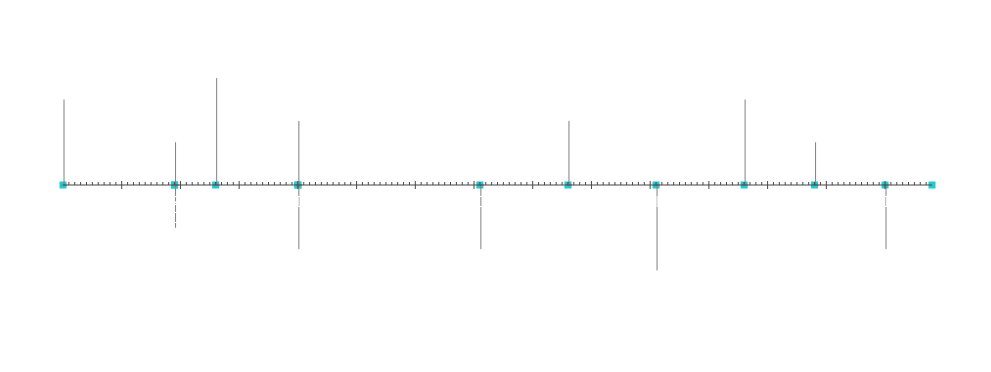
| Category | स्थिति |
|---|---|
| प्रोजेक्ट प्रारंभ | 20 |
| माइलस्टोन 1 | 10 |
| माइलस्टोन 2 | -10 |
| माइलस्टोन 3 | 25 |
| माइलस्टोन 4 | -15 |
| माइलस्टोन 5 | 15 |
| माइलस्टोन 6 | -15 |
| माइलस्टोन 7 | 15 |
| माइलस्टोन 8 | -20 |
| माइलस्टोन 9 | 20 |
| माइलस्टोन 10 | -15 |
| माइलस्टोन 11 | 10 |
| प्रोजेक्ट समाप्त | 5 |